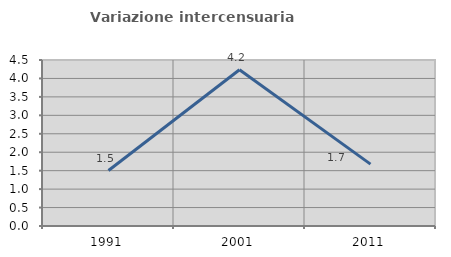
| Category | Variazione intercensuaria annua |
|---|---|
| 1991.0 | 1.504 |
| 2001.0 | 4.234 |
| 2011.0 | 1.677 |